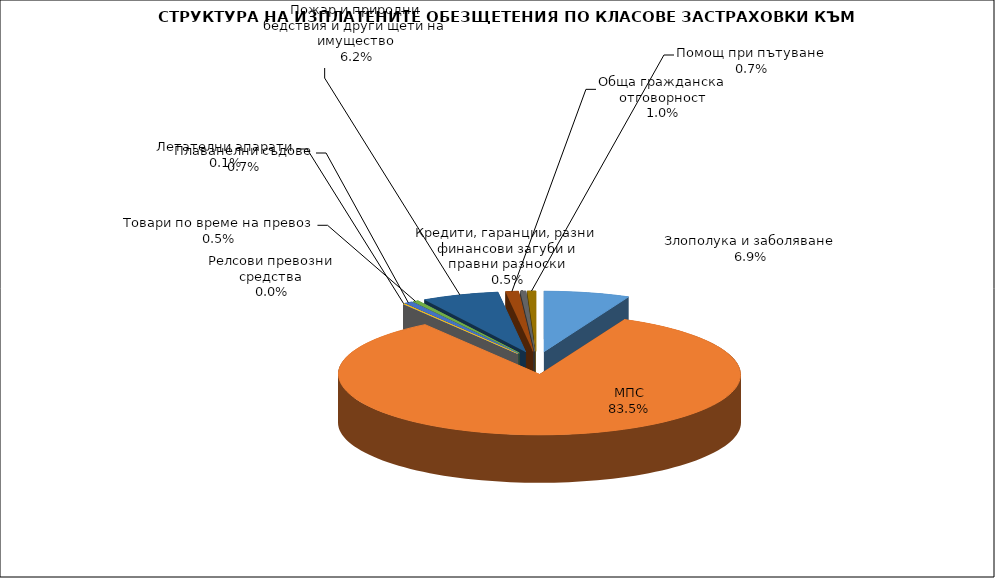
| Category | Злополука и заболяване |
|---|---|
| Злополука и заболяване | 0.069 |
| МПС | 0.835 |
| Релсови превозни средства | 0 |
| Летателни апарати | 0.001 |
| Плаванелни съдове | 0.007 |
| Товари по време на превоз | 0.005 |
| Пожар и природни бедствия и други щети на имущество | 0.062 |
| Обща гражданска отговорност | 0.01 |
| Кредити, гаранции, разни финансови загуби и правни разноски | 0.005 |
| Помощ при пътуване | 0.007 |